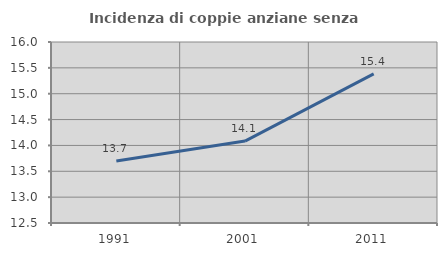
| Category | Incidenza di coppie anziane senza figli  |
|---|---|
| 1991.0 | 13.699 |
| 2001.0 | 14.085 |
| 2011.0 | 15.385 |